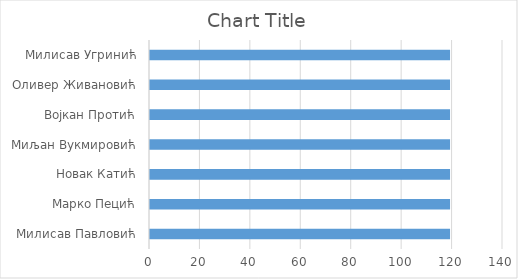
| Category | Series 0 |
|---|---|
| Милисав Павловић | 119 |
| Марко Пецић | 119 |
| Новак Катић | 119 |
| Миљан Вукмировић | 119 |
| Војкан Протић | 119 |
| Оливер Живановић | 119 |
| Милисав Угринић | 119 |